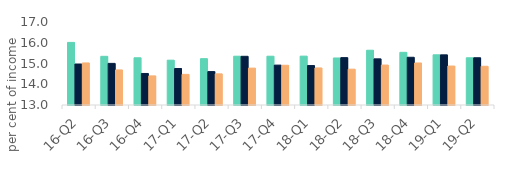
| Category | First-time
buyers | Homemovers | Homowner remortgaging |
|---|---|---|---|
| 16-Q2 | 16.017 | 14.976 | 15.026 |
| 16-Q3 | 15.345 | 15.006 | 14.69 |
| 16-Q4 | 15.275 | 14.519 | 14.403 |
| 17-Q1 | 15.159 | 14.758 | 14.476 |
| 17-Q2 | 15.232 | 14.611 | 14.501 |
| 17-Q3 | 15.351 | 15.346 | 14.778 |
| 17-Q4 | 15.351 | 14.922 | 14.914 |
| 18-Q1 | 15.355 | 14.901 | 14.786 |
| 18-Q2 | 15.266 | 15.282 | 14.726 |
| 18-Q3 | 15.639 | 15.224 | 14.924 |
| 18-Q4 | 15.538 | 15.3 | 15.025 |
| 19-Q1 | 15.419 | 15.417 | 14.878 |
| 19-Q2 | 15.275 | 15.277 | 14.867 |